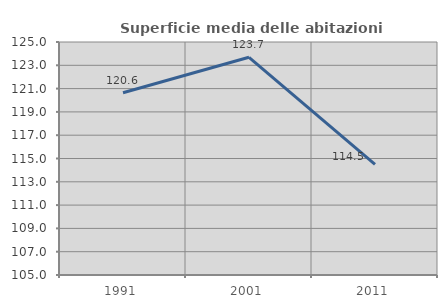
| Category | Superficie media delle abitazioni occupate |
|---|---|
| 1991.0 | 120.641 |
| 2001.0 | 123.688 |
| 2011.0 | 114.497 |